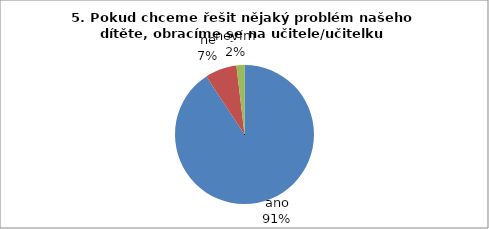
| Category | 5. |
|---|---|
| ano | 49 |
| ne | 4 |
| nevím | 1 |